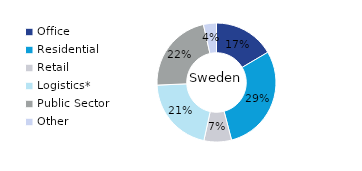
| Category | Sweden |
|---|---|
| Office | 0.165 |
| Residential | 0.294 |
| Retail | 0.075 |
| Logistics* | 0.209 |
| Public Sector | 0.222 |
| Other | 0.035 |